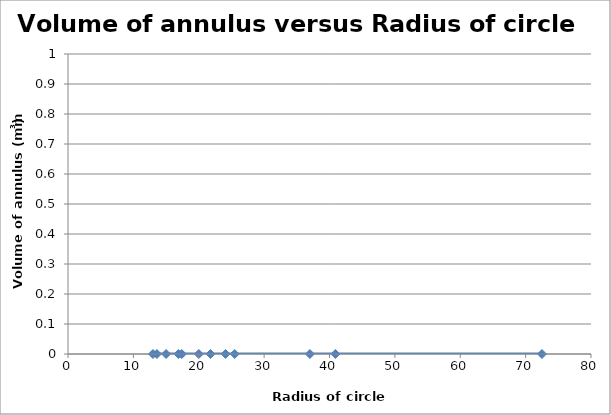
| Category | Series 0 |
|---|---|
| 13.0 | 0 |
| 13.6 | 0 |
| 15.0 | 0 |
| 16.9 | 0 |
| 17.4 | 0 |
| 20.0 | 0 |
| 21.8 | 0 |
| 24.1 | 0 |
| 25.5 | 0 |
| 37.0 | 0 |
| 40.9 | 0 |
| 72.5 | 0 |